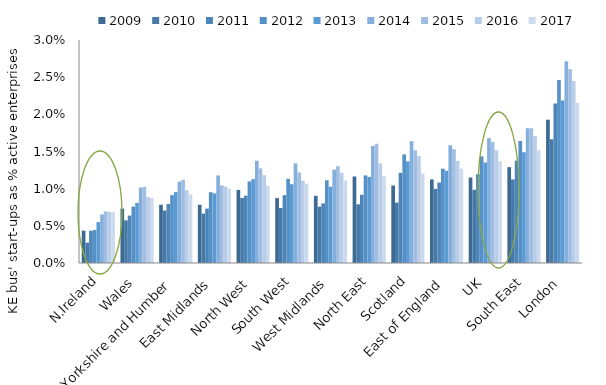
| Category | 2009 | 2010 | 2011 | 2012 | 2013 | 2014 | 2015 | 2016 | 2017 |
|---|---|---|---|---|---|---|---|---|---|
| N.Ireland | 0.004 | 0.003 | 0.004 | 0.004 | 0.006 | 0.007 | 0.007 | 0.007 | 0.007 |
| Wales | 0.007 | 0.006 | 0.006 | 0.008 | 0.008 | 0.01 | 0.01 | 0.009 | 0.009 |
| Yorkshire and Humber | 0.008 | 0.007 | 0.008 | 0.009 | 0.01 | 0.011 | 0.011 | 0.01 | 0.009 |
| East Midlands | 0.008 | 0.007 | 0.007 | 0.01 | 0.009 | 0.012 | 0.01 | 0.01 | 0.01 |
| North West | 0.01 | 0.009 | 0.009 | 0.011 | 0.011 | 0.014 | 0.013 | 0.012 | 0.01 |
| South West | 0.009 | 0.007 | 0.009 | 0.011 | 0.011 | 0.013 | 0.012 | 0.011 | 0.011 |
| West Midlands | 0.009 | 0.008 | 0.008 | 0.011 | 0.01 | 0.013 | 0.013 | 0.012 | 0.011 |
| North East | 0.012 | 0.008 | 0.009 | 0.012 | 0.012 | 0.016 | 0.016 | 0.013 | 0.012 |
| Scotland | 0.01 | 0.008 | 0.012 | 0.015 | 0.014 | 0.016 | 0.015 | 0.014 | 0.012 |
| East of England | 0.011 | 0.01 | 0.011 | 0.013 | 0.012 | 0.016 | 0.015 | 0.014 | 0.013 |
| UK | 0.012 | 0.01 | 0.012 | 0.014 | 0.014 | 0.017 | 0.016 | 0.015 | 0.014 |
| South East | 0.013 | 0.011 | 0.014 | 0.016 | 0.015 | 0.018 | 0.018 | 0.017 | 0.015 |
| London | 0.019 | 0.017 | 0.021 | 0.025 | 0.022 | 0.027 | 0.026 | 0.024 | 0.022 |